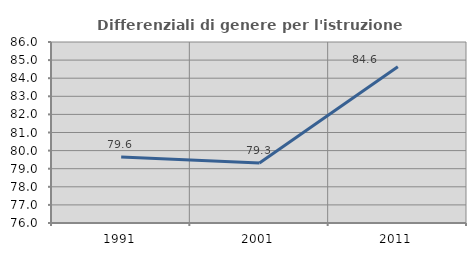
| Category | Differenziali di genere per l'istruzione superiore |
|---|---|
| 1991.0 | 79.64 |
| 2001.0 | 79.31 |
| 2011.0 | 84.637 |